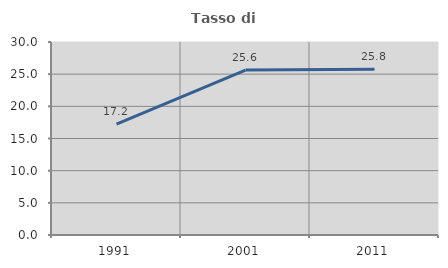
| Category | Tasso di occupazione   |
|---|---|
| 1991.0 | 17.241 |
| 2001.0 | 25.641 |
| 2011.0 | 25.773 |